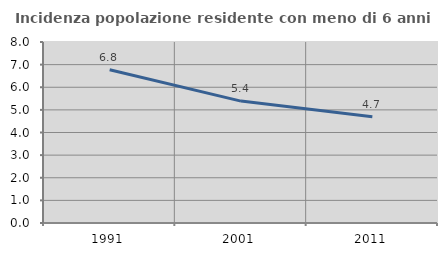
| Category | Incidenza popolazione residente con meno di 6 anni |
|---|---|
| 1991.0 | 6.775 |
| 2001.0 | 5.388 |
| 2011.0 | 4.701 |